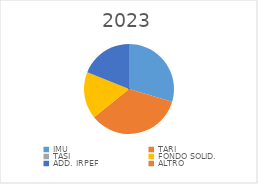
| Category | Series 0 |
|---|---|
| IMU | 2080000 |
| TARI | 2430612 |
| TASI | 0 |
| FONDO SOLID. | 1190000 |
| ADD. IRPEF | 1330000 |
| ALTRO | 0 |